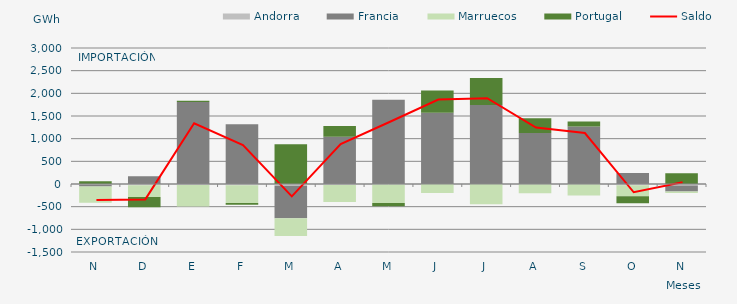
| Category | Andorra | Francia | Marruecos | Portugal |
|---|---|---|---|---|
| N | -15.909 | -39.768 | -355.985 | 61.447 |
| D | -27.709 | 172.379 | -261.638 | -222.96 |
| E | -24.796 | 1810.619 | -470.016 | 24.492 |
| F | -25.31 | 1316.02 | -393.308 | -40.299 |
| M | -38.757 | -716.099 | -394.27 | 875.503 |
| A | -19.567 | 1043.23 | -378.646 | 237.582 |
| M | -12.003 | 1858.226 | -405.06 | -72.803 |
| J | -0.136 | 1569.713 | -200.627 | 495.014 |
| J | -0.226 | 1742.725 | -445.987 | 597.215 |
| A | -4.615 | 1125.357 | -201.623 | 324.903 |
| S | -3.339 | 1270.11 | -251.758 | 109.449 |
| O | -26.446 | 240.099 | -243.372 | -152.75 |
| N | -31.847 | -131.886 | -37.51 | 238.414 |